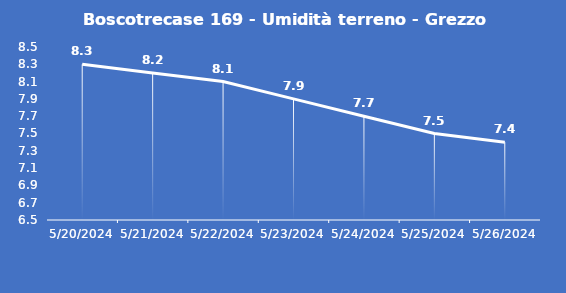
| Category | Boscotrecase 169 - Umidità terreno - Grezzo (%VWC) |
|---|---|
| 5/20/24 | 8.3 |
| 5/21/24 | 8.2 |
| 5/22/24 | 8.1 |
| 5/23/24 | 7.9 |
| 5/24/24 | 7.7 |
| 5/25/24 | 7.5 |
| 5/26/24 | 7.4 |